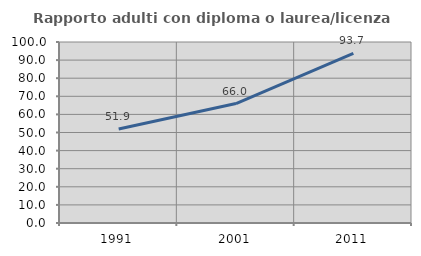
| Category | Rapporto adulti con diploma o laurea/licenza media  |
|---|---|
| 1991.0 | 51.899 |
| 2001.0 | 66.019 |
| 2011.0 | 93.694 |